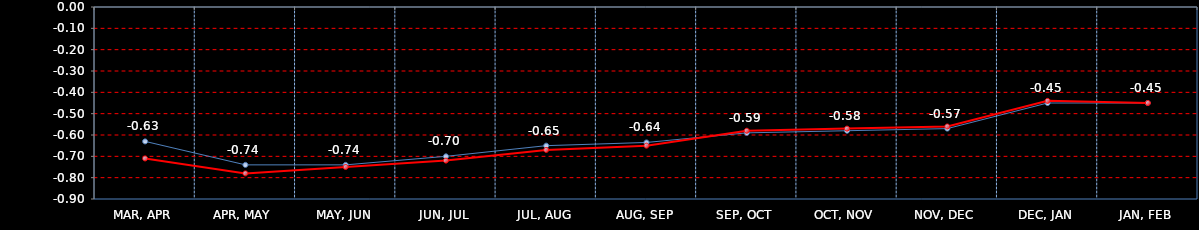
| Category | Last | Settlement | First MA | Second MA | Third MA |
|---|---|---|---|---|---|
| MAR, APR | -0.63 | -0.71 |  |  |  |
| APR, MAY | -0.74 | -0.78 |  |  |  |
| MAY, JUN | -0.74 | -0.75 |  |  |  |
| JUN, JUL | -0.7 | -0.72 |  |  |  |
| JUL, AUG | -0.65 | -0.67 |  |  |  |
| AUG, SEP | -0.635 | -0.65 |  |  |  |
| SEP, OCT | -0.59 | -0.58 |  |  |  |
| OCT, NOV | -0.58 | -0.57 |  |  |  |
| NOV, DEC | -0.57 | -0.56 |  |  |  |
| DEC, JAN | -0.45 | -0.44 |  |  |  |
| JAN, FEB | -0.45 | -0.45 |  |  |  |